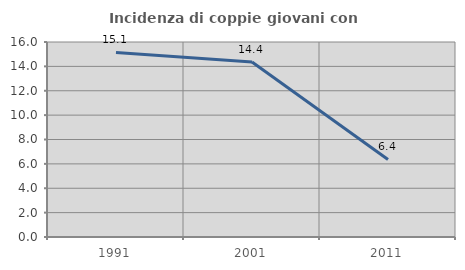
| Category | Incidenza di coppie giovani con figli |
|---|---|
| 1991.0 | 15.145 |
| 2001.0 | 14.366 |
| 2011.0 | 6.366 |